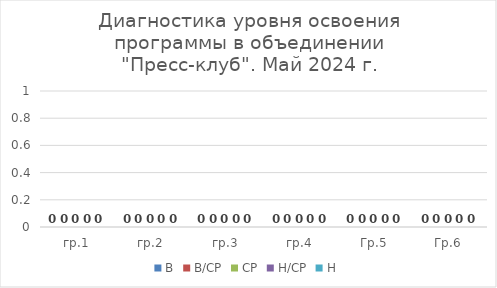
| Category | В | В/СР | СР | Н/СР | Н |
|---|---|---|---|---|---|
| гр.1 | 0 | 0 | 0 | 0 | 0 |
| гр.2 | 0 | 0 | 0 | 0 | 0 |
| гр.3 | 0 | 0 | 0 | 0 | 0 |
| гр.4 | 0 | 0 | 0 | 0 | 0 |
| Гр.5 | 0 | 0 | 0 | 0 | 0 |
| Гр.6 | 0 | 0 | 0 | 0 | 0 |